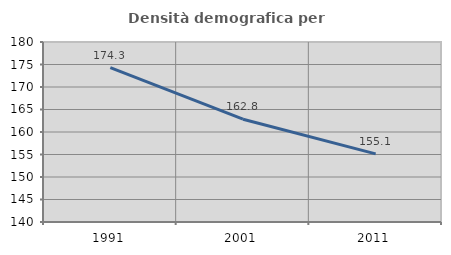
| Category | Densità demografica |
|---|---|
| 1991.0 | 174.311 |
| 2001.0 | 162.846 |
| 2011.0 | 155.142 |